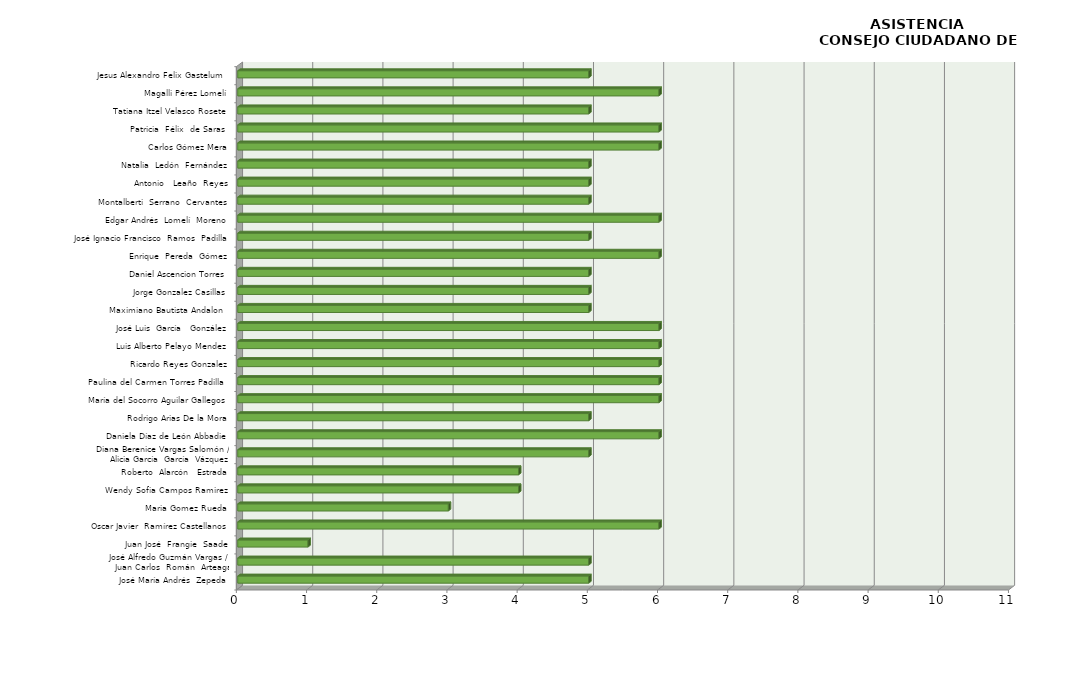
| Category | Series 0 |
|---|---|
| José María Andrés  Zepeda | 5 |
| José Alfredo Guzmán Vargas / 
Juan Carlos  Román  Arteaga | 5 |
| Juan José  Frangie  Saade | 1 |
| Oscar Javier  Ramírez Castellanos | 6 |
| Maria Gomez Rueda | 3 |
| Wendy Sofia Campos Ramirez | 4 |
| Roberto  Alarcón   Estrada | 4 |
| Diana Berenice Vargas Salomón /
Alicia García  García  Vázquez | 5 |
| Daniela Díaz de León Abbadie | 6 |
| Rodrigo Arias De la Mora | 5 |
| María del Socorro Aguilar Gallegos | 6 |
| Paulina del Carmen Torres Padilla  | 6 |
| Ricardo Reyes Gonzalez | 6 |
| Luis Alberto Pelayo Mendez | 6 |
| José Luis  García   González | 6 |
| Maximiano Bautista Andalon  | 5 |
| Jorge Gonzalez Casillas | 5 |
| Daniel Ascencion Torres | 5 |
| Enrique  Pereda  Gómez | 6 |
| José Ignacio Francisco  Ramos  Padilla | 5 |
| Edgar Andrés  Lomelí  Moreno | 6 |
| Montalberti  Serrano  Cervantes | 5 |
| Antonio   Leaño  Reyes | 5 |
| Natalia  Ledón  Fernández | 5 |
| Carlos Gómez Mera | 6 |
| Patricia  Félix  de Saras  | 6 |
| Tatiana Itzel Velasco Rosete | 5 |
| Magalli Pérez Lomelí | 6 |
| Jesus Alexandro Felix Gastelum  | 5 |